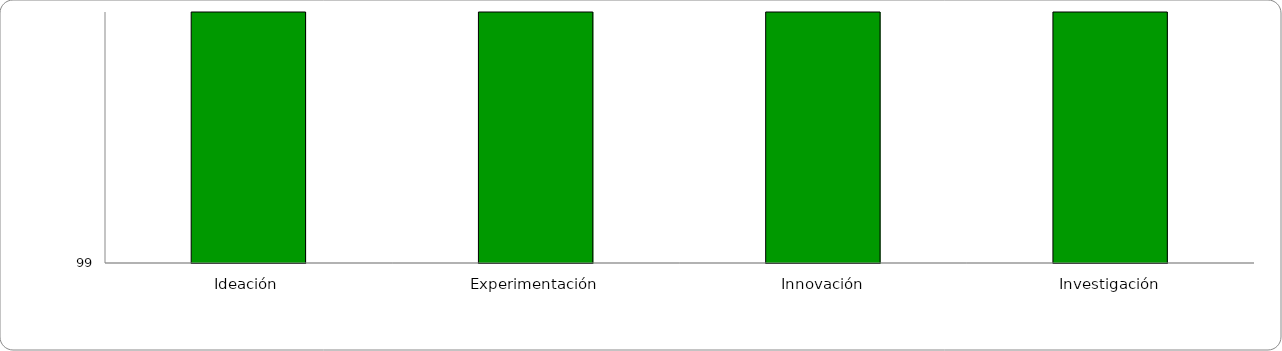
| Category | Niveles |
|---|---|
| Ideación | 100 |
| Experimentación | 100 |
| Innovación | 100 |
| Investigación | 100 |